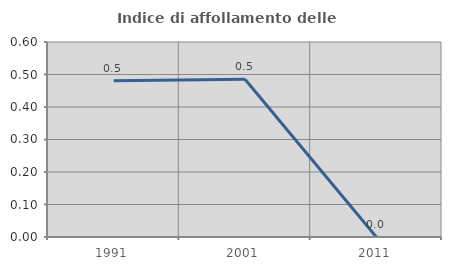
| Category | Indice di affollamento delle abitazioni  |
|---|---|
| 1991.0 | 0.481 |
| 2001.0 | 0.485 |
| 2011.0 | 0 |